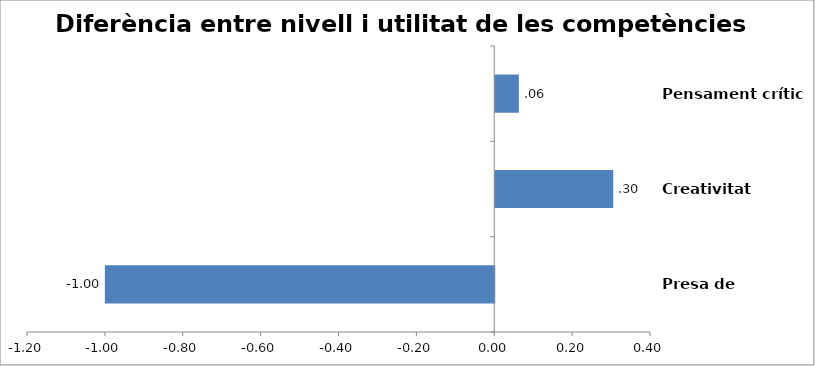
| Category | ARQUITECTURA |
|---|---|
| Presa de decisions | -1 |
| Creativitat | 0.303 |
| Pensament crític | 0.061 |